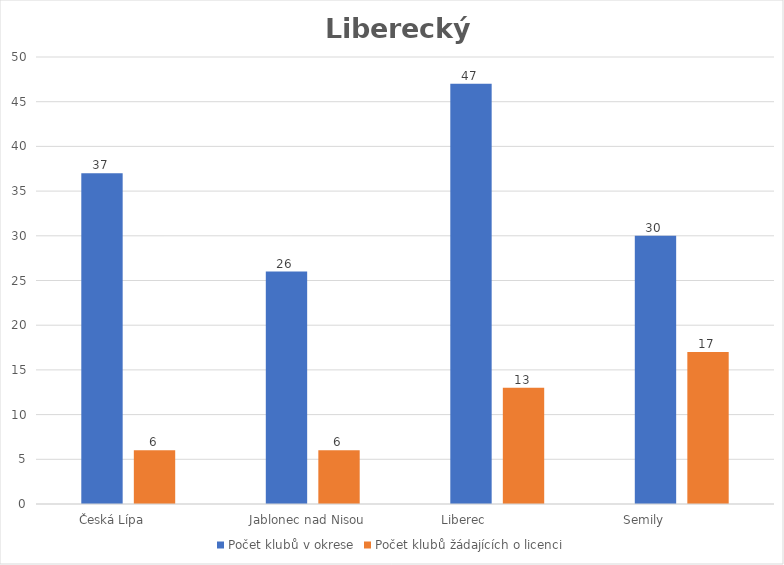
| Category | Počet klubů v okrese | Počet klubů žádajících o licenci |
|---|---|---|
| Česká Lípa         | 37 | 6 |
| Jablonec nad Nisou   | 26 | 6 |
| Liberec                  | 47 | 13 |
| Semily                    | 30 | 17 |